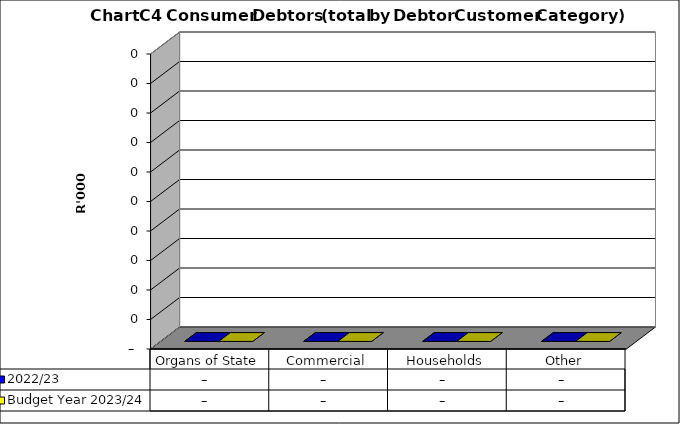
| Category |  2022/23  | Budget Year 2023/24 |
|---|---|---|
| Organs of State | 0 | 0 |
| Commercial | 0 | 0 |
| Households | 0 | 0 |
| Other | 0 | 0 |